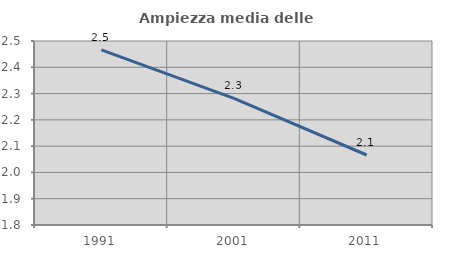
| Category | Ampiezza media delle famiglie |
|---|---|
| 1991.0 | 2.466 |
| 2001.0 | 2.282 |
| 2011.0 | 2.066 |